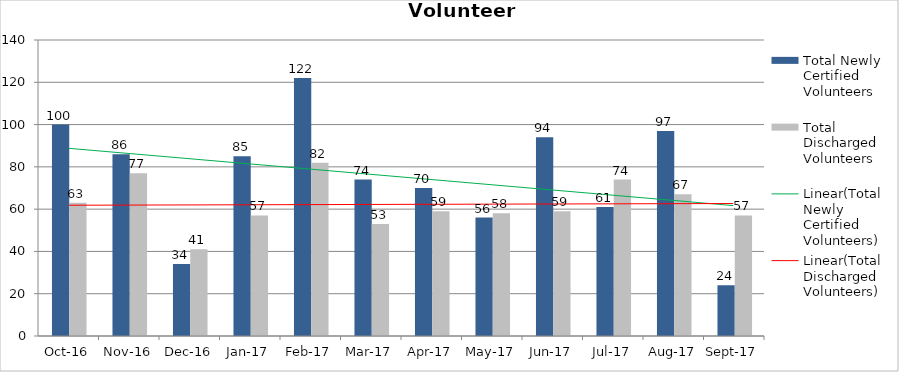
| Category | Total Newly Certified Volunteers | Total Discharged Volunteers |
|---|---|---|
| 2016-10-01 | 100 | 63 |
| 2016-11-01 | 86 | 77 |
| 2016-12-01 | 34 | 41 |
| 2017-01-01 | 85 | 57 |
| 2017-02-01 | 122 | 82 |
| 2017-03-01 | 74 | 53 |
| 2017-04-01 | 70 | 59 |
| 2017-05-01 | 56 | 58 |
| 2017-06-01 | 94 | 59 |
| 2017-07-01 | 61 | 74 |
| 2017-08-01 | 97 | 67 |
| 2017-09-01 | 24 | 57 |